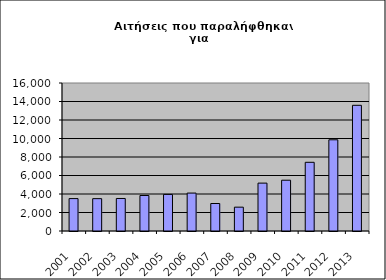
| Category | Series 0 |
|---|---|
| 2001.0 | 3505 |
| 2002.0 | 3497 |
| 2003.0 | 3516 |
| 2004.0 | 3838 |
| 2005.0 | 3956 |
| 2006.0 | 4101 |
| 2007.0 | 2972 |
| 2008.0 | 2577 |
| 2009.0 | 5177 |
| 2010.0 | 5491 |
| 2011.0 | 7426 |
| 2012.0 | 9860 |
| 2013.0 | 13589 |